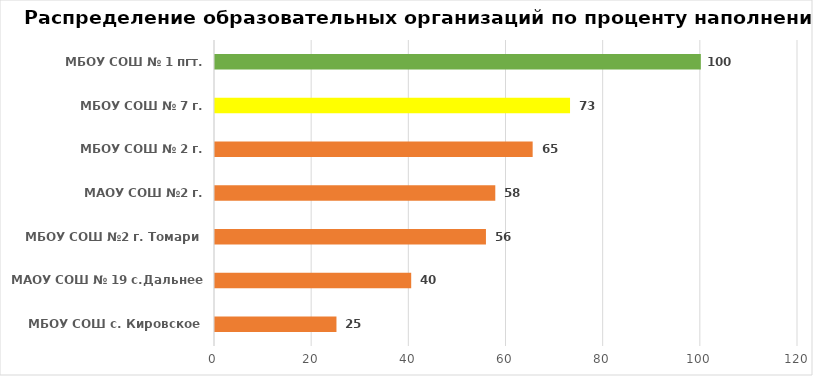
| Category | Series 0 |
|---|---|
| МБОУ СОШ с. Кировское | 25 |
| МАОУ СОШ № 19 с.Дальнее  | 40.385 |
| МБОУ СОШ №2 г. Томари | 55.769 |
| МАОУ СОШ №2 г. Корсакова | 57.692 |
| МБОУ СОШ № 2 г. Невельска | 65.385 |
| МБОУ СОШ № 7 г. Поронайска | 73.077 |
| МБОУ СОШ № 1 пгт. Ноглики | 100 |